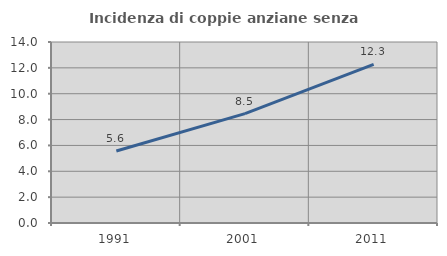
| Category | Incidenza di coppie anziane senza figli  |
|---|---|
| 1991.0 | 5.568 |
| 2001.0 | 8.461 |
| 2011.0 | 12.267 |